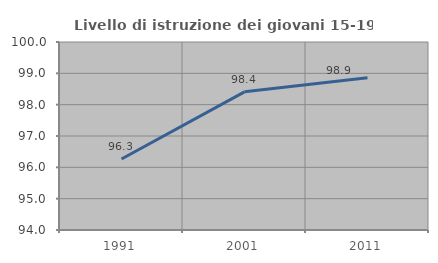
| Category | Livello di istruzione dei giovani 15-19 anni |
|---|---|
| 1991.0 | 96.268 |
| 2001.0 | 98.41 |
| 2011.0 | 98.861 |